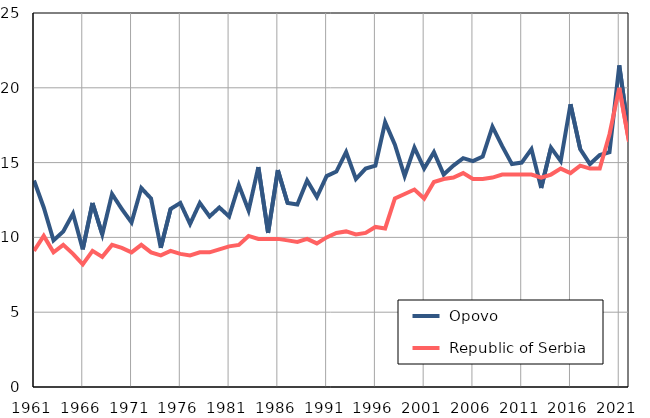
| Category |  Opovo |  Republic of Serbia |
|---|---|---|
| 1961.0 | 13.8 | 9.1 |
| 1962.0 | 12 | 10.1 |
| 1963.0 | 9.8 | 9 |
| 1964.0 | 10.4 | 9.5 |
| 1965.0 | 11.6 | 8.9 |
| 1966.0 | 9.2 | 8.2 |
| 1967.0 | 12.3 | 9.1 |
| 1968.0 | 10.2 | 8.7 |
| 1969.0 | 12.9 | 9.5 |
| 1970.0 | 11.9 | 9.3 |
| 1971.0 | 11 | 9 |
| 1972.0 | 13.3 | 9.5 |
| 1973.0 | 12.6 | 9 |
| 1974.0 | 9.3 | 8.8 |
| 1975.0 | 11.9 | 9.1 |
| 1976.0 | 12.3 | 8.9 |
| 1977.0 | 10.9 | 8.8 |
| 1978.0 | 12.3 | 9 |
| 1979.0 | 11.4 | 9 |
| 1980.0 | 12 | 9.2 |
| 1981.0 | 11.4 | 9.4 |
| 1982.0 | 13.5 | 9.5 |
| 1983.0 | 11.8 | 10.1 |
| 1984.0 | 14.7 | 9.9 |
| 1985.0 | 10.3 | 9.9 |
| 1986.0 | 14.5 | 9.9 |
| 1987.0 | 12.3 | 9.8 |
| 1988.0 | 12.2 | 9.7 |
| 1989.0 | 13.8 | 9.9 |
| 1990.0 | 12.7 | 9.6 |
| 1991.0 | 14.1 | 10 |
| 1992.0 | 14.4 | 10.3 |
| 1993.0 | 15.7 | 10.4 |
| 1994.0 | 13.9 | 10.2 |
| 1995.0 | 14.6 | 10.3 |
| 1996.0 | 14.8 | 10.7 |
| 1997.0 | 17.7 | 10.6 |
| 1998.0 | 16.2 | 12.6 |
| 1999.0 | 14.1 | 12.9 |
| 2000.0 | 16 | 13.2 |
| 2001.0 | 14.6 | 12.6 |
| 2002.0 | 15.7 | 13.7 |
| 2003.0 | 14.2 | 13.9 |
| 2004.0 | 14.8 | 14 |
| 2005.0 | 15.3 | 14.3 |
| 2006.0 | 15.1 | 13.9 |
| 2007.0 | 15.4 | 13.9 |
| 2008.0 | 17.4 | 14 |
| 2009.0 | 16.1 | 14.2 |
| 2010.0 | 14.9 | 14.2 |
| 2011.0 | 15 | 14.2 |
| 2012.0 | 15.9 | 14.2 |
| 2013.0 | 13.3 | 14 |
| 2014.0 | 16 | 14.2 |
| 2015.0 | 15.1 | 14.6 |
| 2016.0 | 18.9 | 14.3 |
| 2017.0 | 15.9 | 14.8 |
| 2018.0 | 14.9 | 14.6 |
| 2019.0 | 15.5 | 14.6 |
| 2020.0 | 15.7 | 16.9 |
| 2021.0 | 21.5 | 20 |
| 2022.0 | 16.8 | 16.4 |